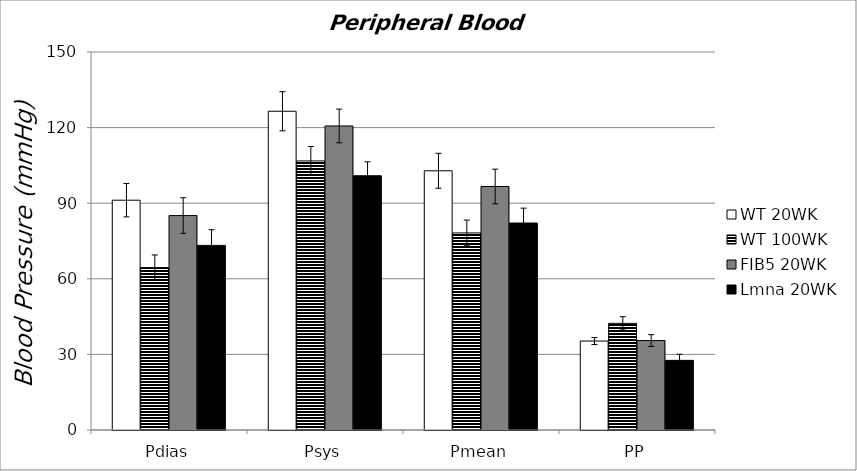
| Category | WT 20WK | WT 100WK | FIB5 20WK | Lmna 20WK |
|---|---|---|---|---|
| Pdias | 91.193 | 64.46 | 85.094 | 73.258 |
| Psys | 126.489 | 106.782 | 120.657 | 100.888 |
| Pmean | 102.861 | 78.202 | 96.634 | 82.125 |
| PP | 35.297 | 42.322 | 35.493 | 27.63 |